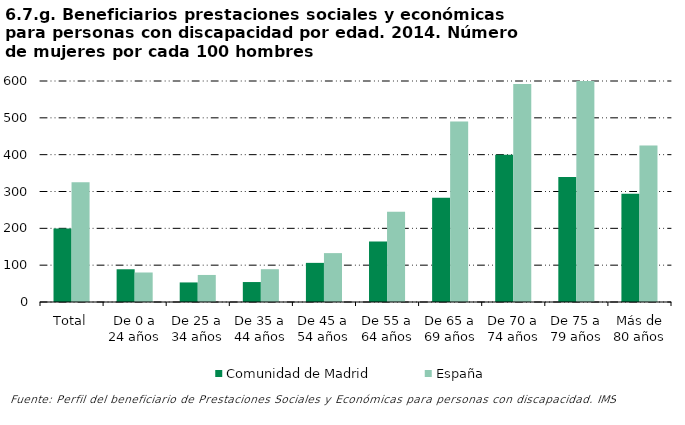
| Category | Comunidad de Madrid | España |
|---|---|---|
| Total | 199.604 | 325.146 |
| De 0 a 24 años | 88.889 | 80.114 |
| De 25 a 34 años | 53.125 | 73.451 |
| De 35 a 44 años | 54.167 | 89.008 |
| De 45 a 54 años | 106.25 | 132.717 |
| De 55 a 64 años | 164.078 | 245.176 |
| De 65 a 69 años | 283.333 | 490.04 |
| De 70 a 74 años | 400 | 591.852 |
| De 75 a 79 años | 339.474 | 614.159 |
| Más de 80 años | 293.636 | 425.152 |